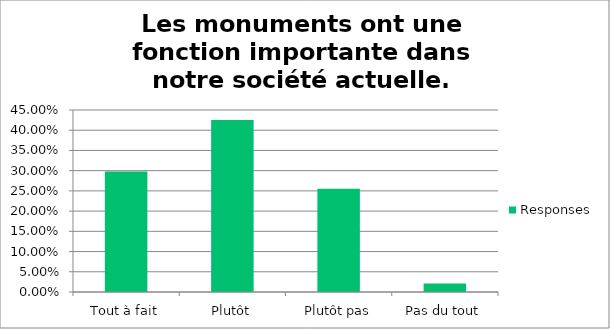
| Category | Responses |
|---|---|
| Tout à fait | 0.298 |
| Plutôt | 0.426 |
| Plutôt pas | 0.255 |
| Pas du tout | 0.021 |